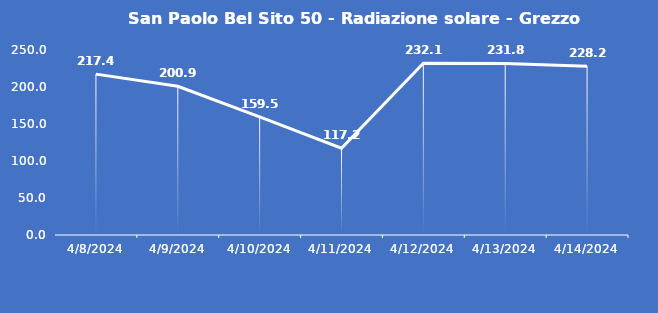
| Category | San Paolo Bel Sito 50 - Radiazione solare - Grezzo (W/m2) |
|---|---|
| 4/8/24 | 217.4 |
| 4/9/24 | 200.9 |
| 4/10/24 | 159.5 |
| 4/11/24 | 117.2 |
| 4/12/24 | 232.1 |
| 4/13/24 | 231.8 |
| 4/14/24 | 228.2 |